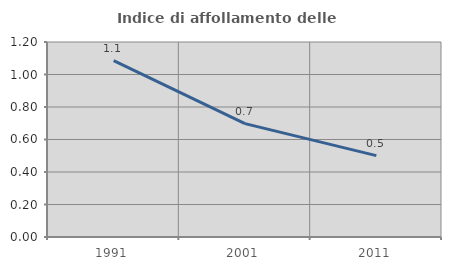
| Category | Indice di affollamento delle abitazioni  |
|---|---|
| 1991.0 | 1.085 |
| 2001.0 | 0.698 |
| 2011.0 | 0.501 |